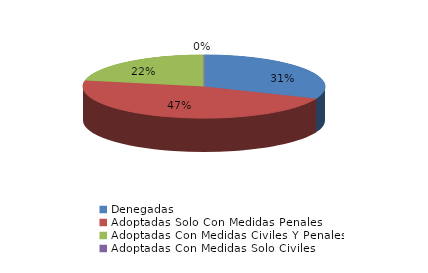
| Category | Series 0 |
|---|---|
| Denegadas | 10 |
| Adoptadas Solo Con Medidas Penales | 15 |
| Adoptadas Con Medidas Civiles Y Penales | 7 |
| Adoptadas Con Medidas Solo Civiles | 0 |